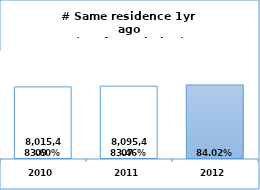
| Category | Chosen | Unchosen | Blank |
|---|---|---|---|
| 2010.0 | 0 | 8015409 | 1571828 |
| 2011.0 | 0 | 8095407 | 1604452 |
| 2012.0 | 8231384 | 0 | 1565163 |